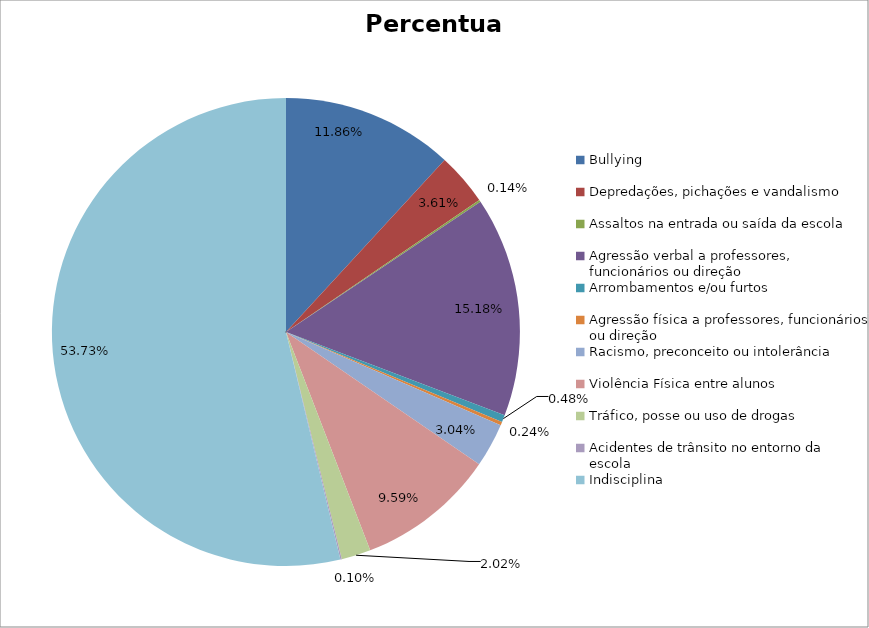
| Category | Percentual |
|---|---|
| Bullying | 0.119 |
| Depredações, pichações e vandalismo | 0.036 |
| Assaltos na entrada ou saída da escola | 0.001 |
| Agressão verbal a professores, funcionários ou direção | 0.152 |
| Arrombamentos e/ou furtos | 0.005 |
| Agressão física a professores, funcionários ou direção | 0.002 |
| Racismo, preconceito ou intolerância | 0.03 |
| Violência Física entre alunos | 0.096 |
| Tráfico, posse ou uso de drogas | 0.02 |
| Acidentes de trânsito no entorno da escola | 0.001 |
| Indisciplina | 0.537 |